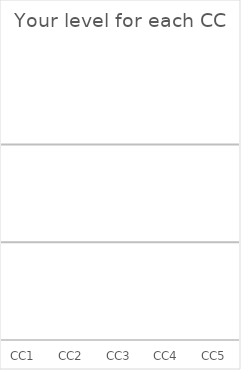
| Category | Level 1: Project Office |
|---|---|
| CC1 | 0 |
| CC2 | 0 |
| CC3 | 0 |
| CC4 | 0 |
| CC5 | 0 |